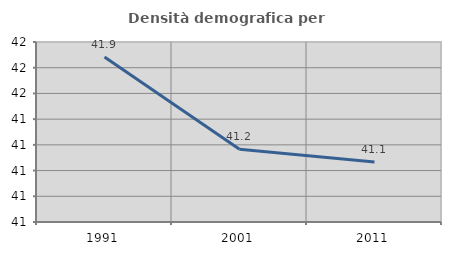
| Category | Densità demografica |
|---|---|
| 1991.0 | 41.883 |
| 2001.0 | 41.165 |
| 2011.0 | 41.066 |